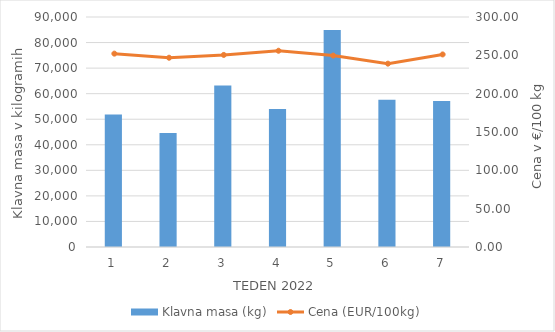
| Category | Klavna masa (kg) |
|---|---|
| 1.0 | 51818 |
| 2.0 | 44619 |
| 3.0 | 63233 |
| 4.0 | 53993 |
| 5.0 | 84871 |
| 6.0 | 57648 |
| 7.0 | 57159 |